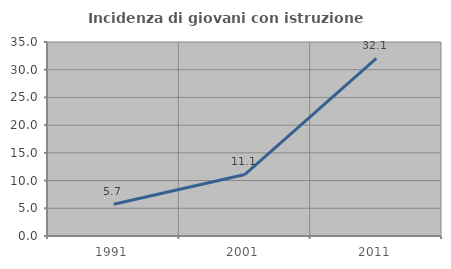
| Category | Incidenza di giovani con istruzione universitaria |
|---|---|
| 1991.0 | 5.714 |
| 2001.0 | 11.111 |
| 2011.0 | 32.051 |